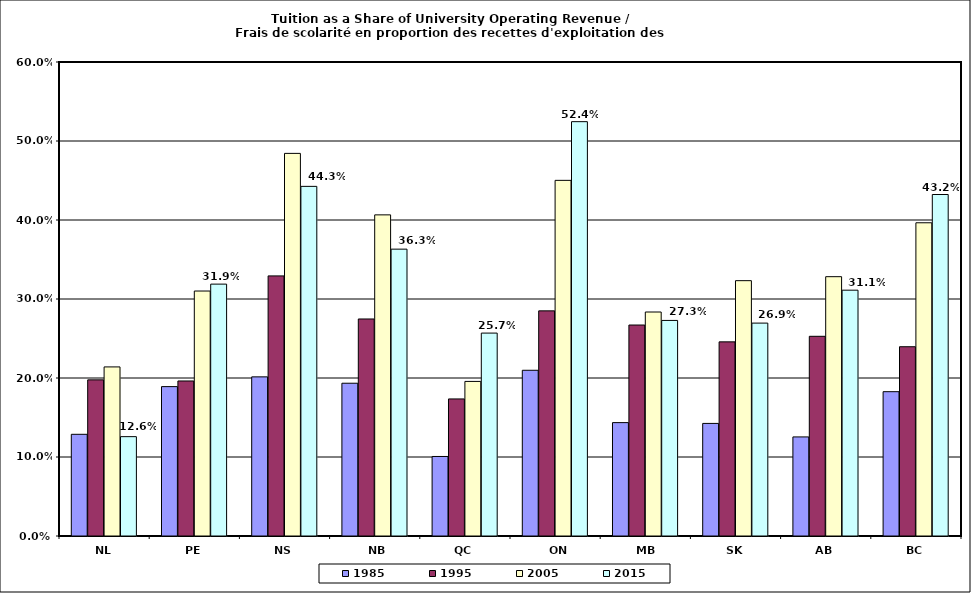
| Category | 1985 | 1995 | 2005 | 2015 |
|---|---|---|---|---|
| NL | 0.129 | 0.198 | 0.214 | 0.126 |
| PE | 0.189 | 0.196 | 0.31 | 0.319 |
| NS | 0.201 | 0.329 | 0.484 | 0.443 |
| NB | 0.193 | 0.275 | 0.407 | 0.363 |
| QC | 0.101 | 0.174 | 0.196 | 0.257 |
| ON | 0.21 | 0.285 | 0.45 | 0.524 |
| MB | 0.144 | 0.267 | 0.284 | 0.273 |
| SK | 0.143 | 0.246 | 0.323 | 0.269 |
| AB | 0.125 | 0.253 | 0.328 | 0.311 |
| BC | 0.183 | 0.24 | 0.396 | 0.432 |